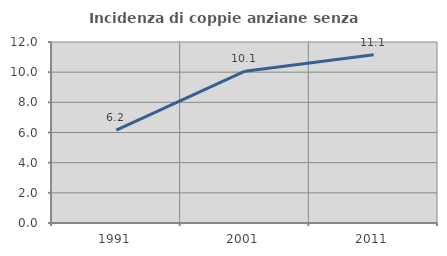
| Category | Incidenza di coppie anziane senza figli  |
|---|---|
| 1991.0 | 6.158 |
| 2001.0 | 10.067 |
| 2011.0 | 11.15 |